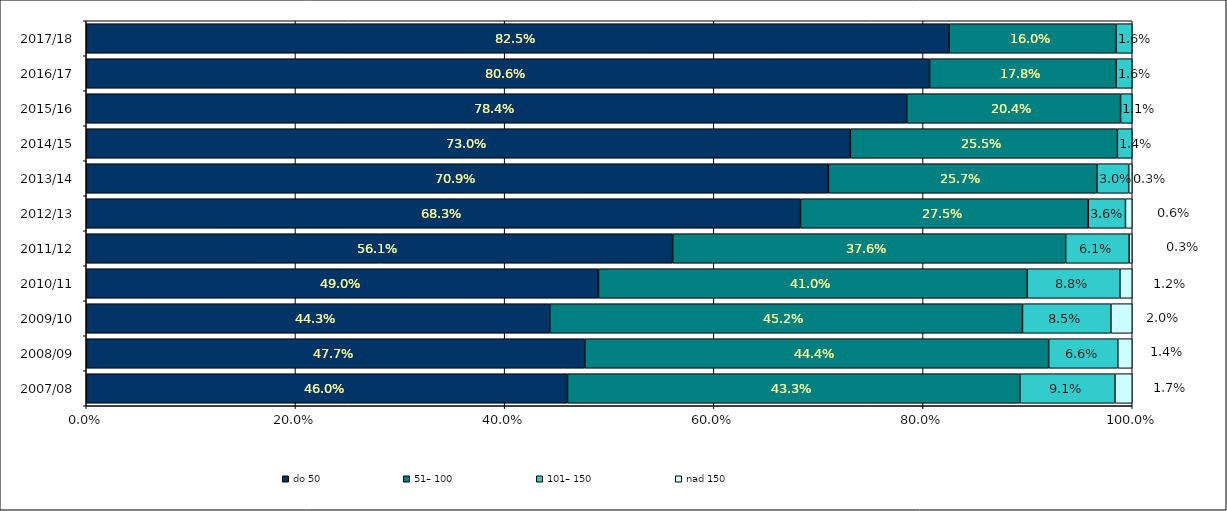
| Category | do 50 | 51– 100 | 101– 150 | nad 150 |
|---|---|---|---|---|
| 2007/08 | 0.46 | 0.433 | 0.091 | 0.017 |
| 2008/09 | 0.477 | 0.444 | 0.066 | 0.014 |
| 2009/10 | 0.443 | 0.452 | 0.085 | 0.02 |
| 2010/11 | 0.49 | 0.41 | 0.088 | 0.012 |
| 2011/12 | 0.561 | 0.376 | 0.061 | 0.003 |
| 2012/13 | 0.683 | 0.275 | 0.036 | 0.006 |
| 2013/14 | 0.709 | 0.257 | 0.03 | 0.003 |
| 2014/15 | 0.73 | 0.255 | 0.014 | 0 |
| 2015/16 | 0.784 | 0.204 | 0.011 | 0 |
| 2016/17 | 0.806 | 0.178 | 0.016 | 0 |
| 2017/18 | 0.825 | 0.16 | 0.016 | 0 |